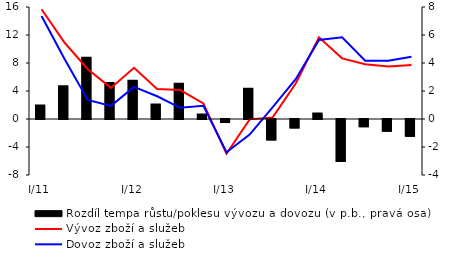
| Category | Rozdíl tempa růstu/poklesu vývozu a dovozu (v p.b., pravá osa) |
|---|---|
| I/11 | 0.957 |
| II | 2.345 |
| III | 4.383 |
| IV | 2.572 |
| I/12 | 2.74 |
| II | 1.037 |
| III | 2.525 |
| IV | 0.321 |
| I/13 | -0.218 |
| II | 2.17 |
| III | -1.46 |
| IV | -0.604 |
| I/14 | 0.385 |
| II | -2.999 |
| III | -0.517 |
| IV | -0.834 |
| I/15 | -1.204 |